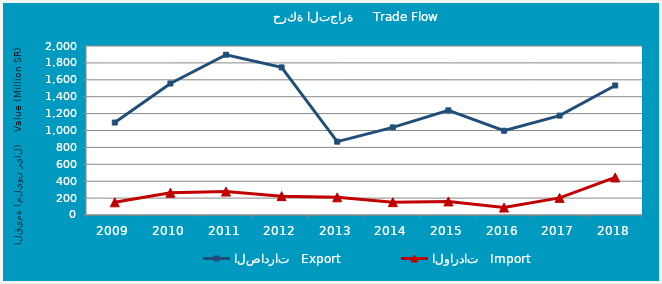
| Category | الصادرات   Export | الواردات   Import |
|---|---|---|
| 2009.0 | 1094118554 | 150166572 |
| 2010.0 | 1556322672 | 263137996 |
| 2011.0 | 1896759733 | 277292513 |
| 2012.0 | 1746605486 | 223005862 |
| 2013.0 | 867953017 | 209133826 |
| 2014.0 | 1036643266 | 151648168 |
| 2015.0 | 1238482647 | 160658555 |
| 2016.0 | 997079273 | 88090102 |
| 2017.0 | 1176085674 | 202313397 |
| 2018.0 | 1532796060 | 444279222 |